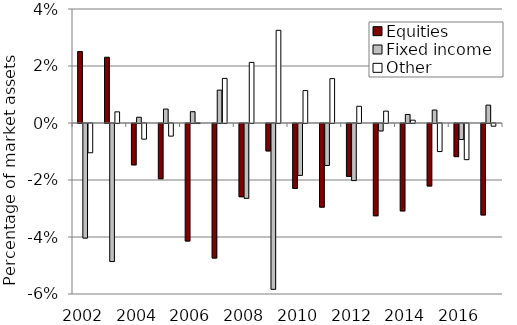
| Category | Equities | Fixed income | Other |
|---|---|---|---|
| 2002.0 | 0.025 | -0.04 | -0.01 |
| 2003.0 | 0.023 | -0.048 | 0.004 |
| 2004.0 | -0.015 | 0.002 | -0.005 |
| 2005.0 | -0.019 | 0.005 | -0.004 |
| 2006.0 | -0.041 | 0.004 | 0 |
| 2007.0 | -0.047 | 0.012 | 0.016 |
| 2008.0 | -0.026 | -0.026 | 0.021 |
| 2009.0 | -0.01 | -0.058 | 0.033 |
| 2010.0 | -0.023 | -0.018 | 0.011 |
| 2011.0 | -0.029 | -0.015 | 0.016 |
| 2012.0 | -0.019 | -0.02 | 0.006 |
| 2013.0 | -0.032 | -0.003 | 0.004 |
| 2014.0 | -0.031 | 0.003 | 0.001 |
| 2015.0 | -0.022 | 0.005 | -0.01 |
| 2016.0 | -0.012 | -0.006 | -0.013 |
| 2017.0 | -0.032 | 0.006 | -0.001 |